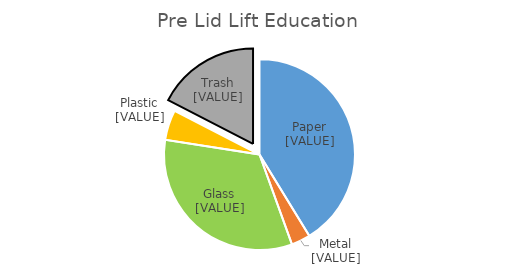
| Category | Series 0 |
|---|---|
| Paper | 0.413 |
| Metals | 0.032 |
| Glass | 0.33 |
| Plastic | 0.051 |
| Trash  | 0.174 |